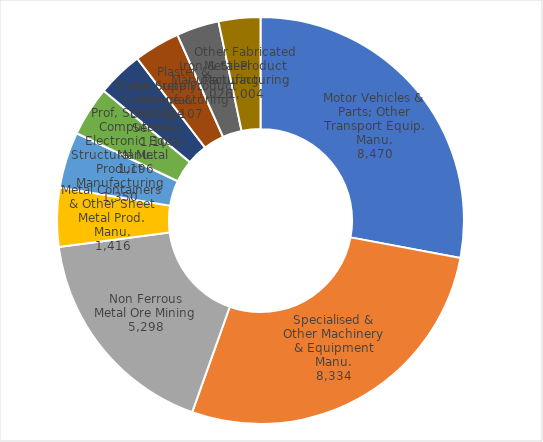
| Category | Series 0 |
|---|---|
| Motor Vehicles & Parts; Other Transport Equip. Manu. | 8469.76 |
| Specialised & Other Machinery & Equipment Manu. | 8334.224 |
| Non Ferrous Metal Ore Mining | 5297.54 |
| Metal Containers & Other Sheet Metal Prod. Manu. | 1415.563 |
| Structural Metal Product Manufacturing | 1349.692 |
| Prof, Scientific, Computer & Electronic Equip. Manu. | 1196.041 |
| Water Supply, Sewerage & Drainage Services | 1106.92 |
| Plaster & Concrete Product Manufacturing | 1106.7 |
| Iron & Steel Manufacturing | 1025.817 |
| Other Fabricated Metal Product Manufacturing | 1003.661 |